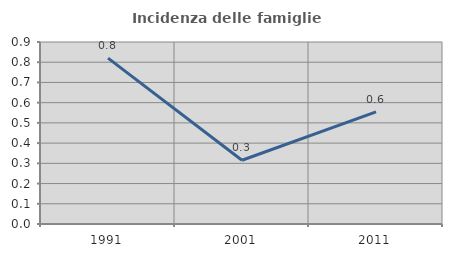
| Category | Incidenza delle famiglie numerose |
|---|---|
| 1991.0 | 0.82 |
| 2001.0 | 0.315 |
| 2011.0 | 0.555 |